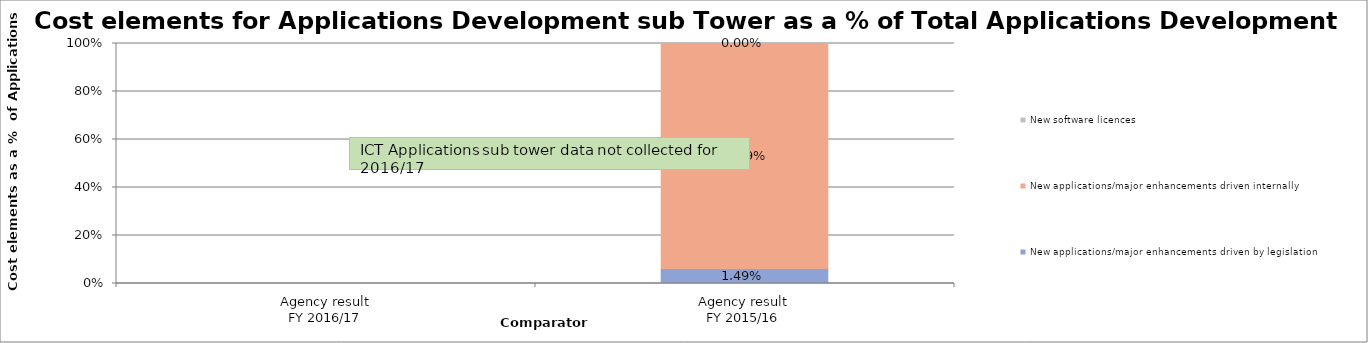
| Category | New applications/major enhancements driven by legislation | New applications/major enhancements driven internally | New software licences |
|---|---|---|---|
| Agency result
FY 2016/17 | 0 | 0 | 0 |
| Agency result
FY 2015/16 | 0.015 | 0.24 | 0 |